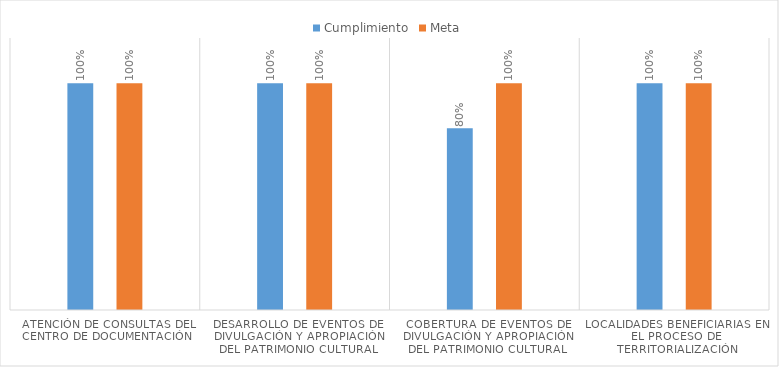
| Category | Cumplimiento  | Meta  |
|---|---|---|
| Atención de consultas del Centro de Documentación  | 1 | 1 |
| Desarrollo de eventos de divulgación y apropiación del patrimonio cultural | 1 | 1 |
| Cobertura de eventos de divulgación y apropiación del patrimonio cultural | 0.802 | 1 |
| Localidades beneficiarias en el proceso de territorialización | 1 | 1 |